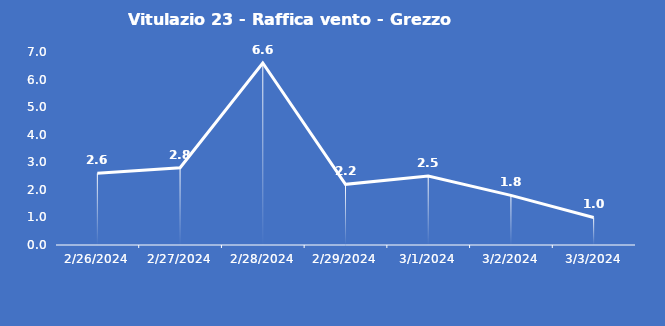
| Category | Vitulazio 23 - Raffica vento - Grezzo (m/s) |
|---|---|
| 2/26/24 | 2.6 |
| 2/27/24 | 2.8 |
| 2/28/24 | 6.6 |
| 2/29/24 | 2.2 |
| 3/1/24 | 2.5 |
| 3/2/24 | 1.8 |
| 3/3/24 | 1 |